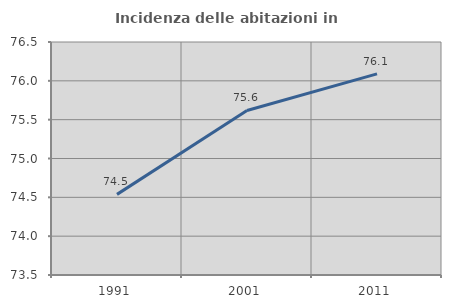
| Category | Incidenza delle abitazioni in proprietà  |
|---|---|
| 1991.0 | 74.538 |
| 2001.0 | 75.618 |
| 2011.0 | 76.09 |